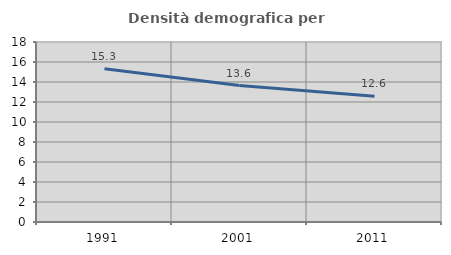
| Category | Densità demografica |
|---|---|
| 1991.0 | 15.33 |
| 2001.0 | 13.644 |
| 2011.0 | 12.571 |